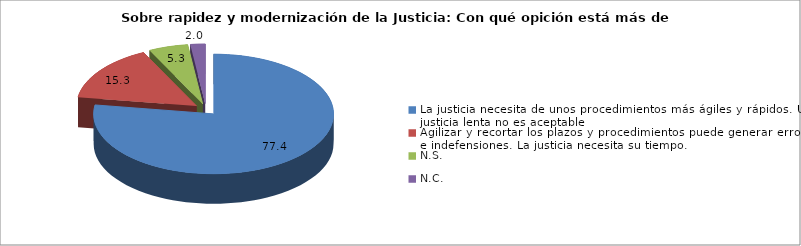
| Category | % |
|---|---|
| La justicia necesita de unos procedimientos más ágiles y rápidos. Una justicia lenta no es aceptable | 77.4 |
| Agilizar y recortar los plazos y procedimientos puede generar errores e indefensiones. La justicia necesita su tiempo.  | 15.3 |
| N.S. | 5.3 |
| N.C. | 2 |